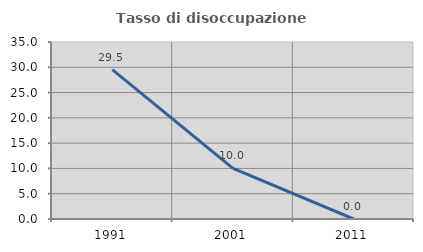
| Category | Tasso di disoccupazione giovanile  |
|---|---|
| 1991.0 | 29.545 |
| 2001.0 | 10 |
| 2011.0 | 0 |